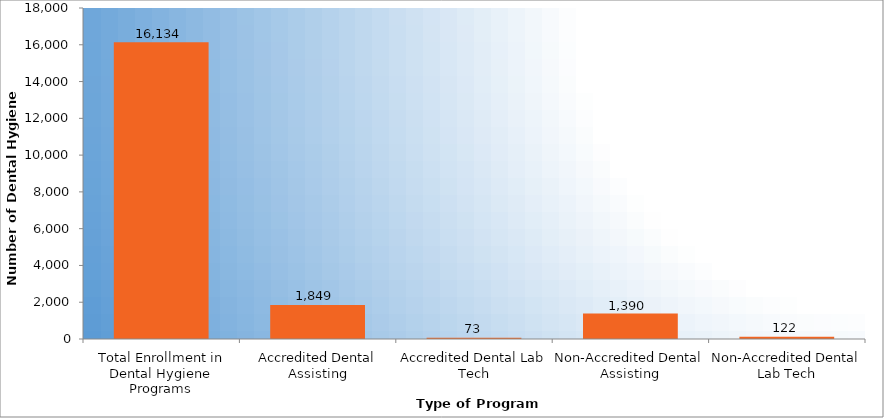
| Category | Number of Dental Hygiene Students |
|---|---|
| Total Enrollment in Dental Hygiene Programs | 16134 |
| Accredited Dental Assisting | 1849 |
| Accredited Dental Lab Tech | 73 |
| Non-Accredited Dental Assisting | 1390 |
| Non-Accredited Dental Lab Tech | 122 |